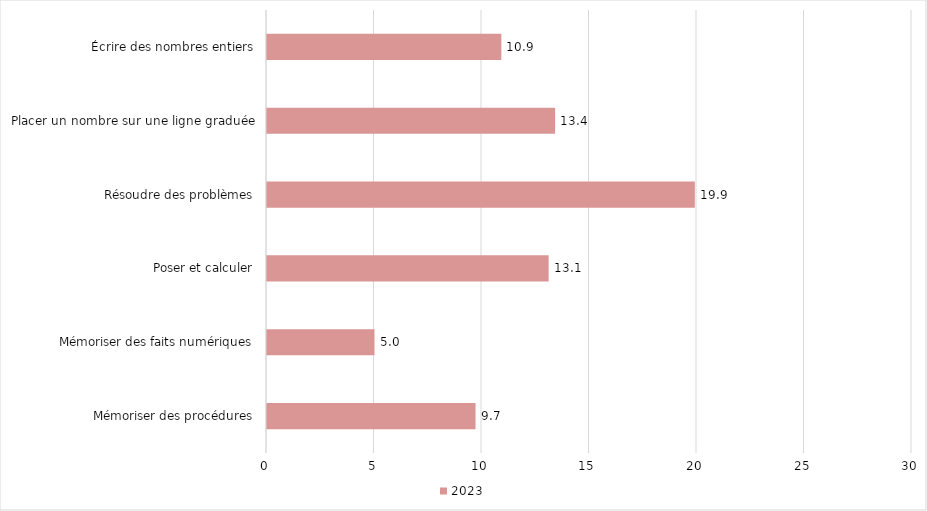
| Category | 2023 |
|---|---|
| Mémoriser des procédures | 9.7 |
| Mémoriser des faits numériques | 5 |
| Poser et calculer | 13.1 |
| Résoudre des problèmes | 19.9 |
| Placer un nombre sur une ligne graduée | 13.4 |
| Écrire des nombres entiers | 10.9 |